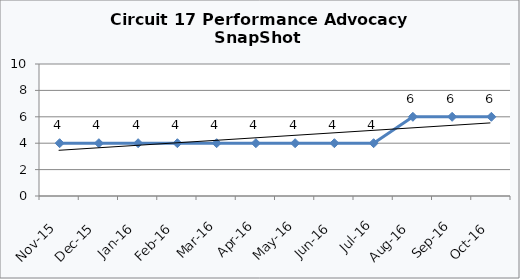
| Category | Circuit 17 |
|---|---|
| Nov-15 | 4 |
| Dec-15 | 4 |
| Jan-16 | 4 |
| Feb-16 | 4 |
| Mar-16 | 4 |
| Apr-16 | 4 |
| May-16 | 4 |
| Jun-16 | 4 |
| Jul-16 | 4 |
| Aug-16 | 6 |
| Sep-16 | 6 |
| Oct-16 | 6 |